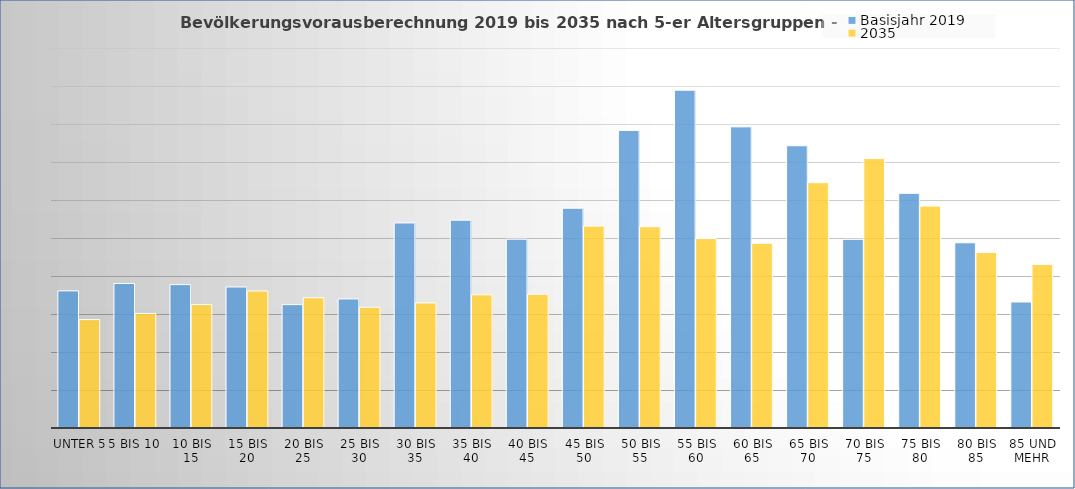
| Category | Basisjahr 2019 | 2035 |
|---|---|---|
| unter 5 | 7217 | 5704 |
| 5 bis 10 | 7606 | 6030 |
| 10 bis 15 | 7547 | 6495 |
| 15 bis 20 | 7422 | 7213 |
| 20 bis 25 | 6494 | 6856 |
| 25 bis 30 | 6793 | 6354 |
| 30 bis 35 | 10792 | 6583 |
| 35 bis 40 | 10938 | 7010 |
| 40 bis 45 | 9939 | 7041 |
| 45 bis 50 | 11568 | 10627 |
| 50 bis 55 | 15663 | 10594 |
| 55 bis 60 | 17780 | 9970 |
| 60 bis 65 | 15850 | 9722 |
| 65 bis 70 | 14856 | 12912 |
| 70 bis 75 | 9929 | 14182 |
| 75 bis 80 | 12351 | 11680 |
| 80 bis 85 | 9748 | 9236 |
| 85 und mehr | 6632 | 8611 |